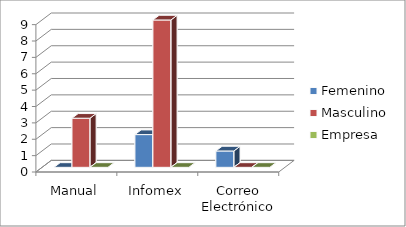
| Category | Femenino | Masculino | Empresa |
|---|---|---|---|
| 0 | 0 | 3 | 0 |
| 1 | 2 | 9 | 0 |
| 2 | 1 | 0 | 0 |